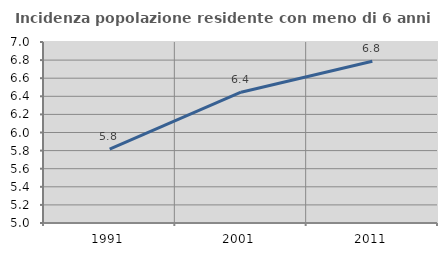
| Category | Incidenza popolazione residente con meno di 6 anni |
|---|---|
| 1991.0 | 5.817 |
| 2001.0 | 6.446 |
| 2011.0 | 6.788 |